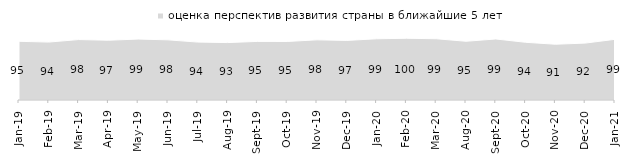
| Category | оценка перспектив развития страны в ближайшие 5 лет |
|---|---|
| 2019-01-01 | 95.25 |
| 2019-02-01 | 94.05 |
| 2019-03-01 | 98.11 |
| 2019-04-01 | 97.03 |
| 2019-05-01 | 98.91 |
| 2019-06-01 | 97.656 |
| 2019-07-01 | 94.01 |
| 2019-08-01 | 93.207 |
| 2019-09-01 | 95.099 |
| 2019-10-01 | 95 |
| 2019-11-01 | 97.673 |
| 2019-12-01 | 96.733 |
| 2020-01-01 | 99.356 |
| 2020-02-01 | 100.198 |
| 2020-03-01 | 99.455 |
| 2020-08-01 | 95.333 |
| 2020-09-01 | 99.054 |
| 2020-10-01 | 93.672 |
| 2020-11-01 | 90.55 |
| 2020-12-01 | 92.365 |
| 2021-01-01 | 98.51 |